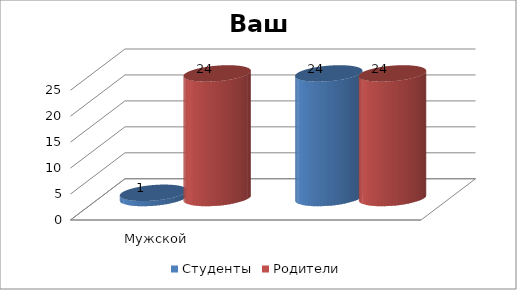
| Category | Студенты | Родители |
|---|---|---|
| Мужской | 1 | 24 |